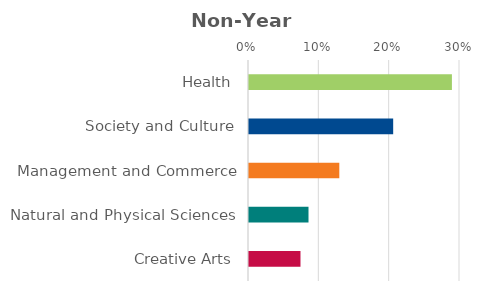
| Category | Series 0 |
|---|---|
| Health | 0.288 |
| Society and Culture | 0.205 |
| Management and Commerce | 0.128 |
| Natural and Physical Sciences | 0.085 |
| Creative Arts | 0.073 |